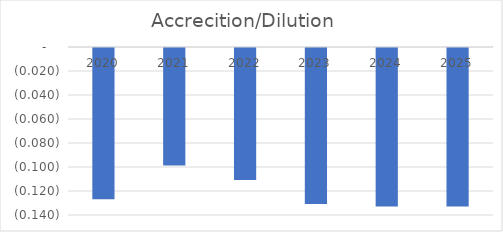
| Category | Accrecition/Dilution |
|---|---|
| 2020.0 | -0.126 |
| 2021.0 | -0.098 |
| 2022.0 | -0.11 |
| 2023.0 | -0.13 |
| 2024.0 | -0.132 |
| 2025.0 | -0.132 |